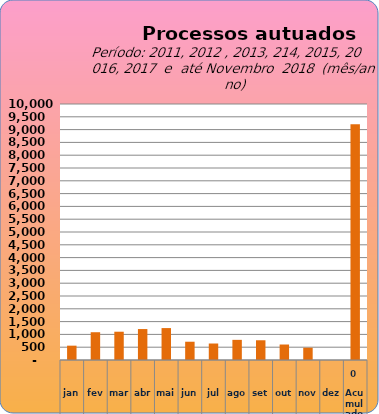
| Category | 6735 |
|---|---|
| jan | 560 |
| fev | 1085 |
| mar | 1105 |
| abr | 1209 |
| mai | 1247 |
| jun | 714 |
| jul | 644 |
| ago | 787 |
| set | 771 |
| out | 605 |
| nov | 480 |
| dez | 0 |
| Acumulado
 | 9207 |